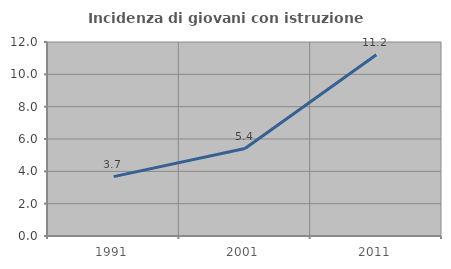
| Category | Incidenza di giovani con istruzione universitaria |
|---|---|
| 1991.0 | 3.672 |
| 2001.0 | 5.412 |
| 2011.0 | 11.208 |